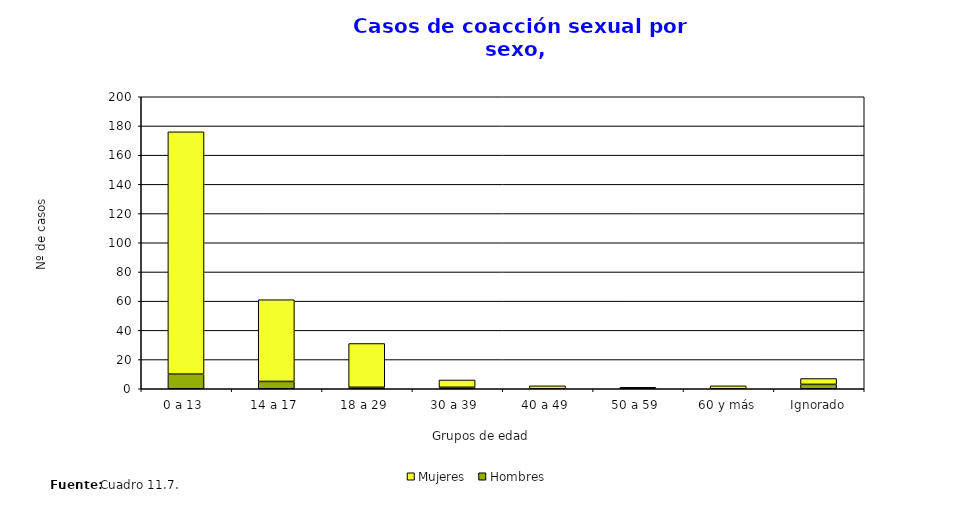
| Category | Hombres | Mujeres |
|---|---|---|
| 0 a 13  | 10 | 166 |
| 14 a 17  | 5 | 56 |
| 18 a 29  | 1 | 30 |
| 30 a 39  | 1 | 5 |
| 40 a 49  | 0 | 2 |
| 50 a 59  | 0 | 1 |
| 60 y más | 0 | 2 |
| Ignorado | 3 | 4 |